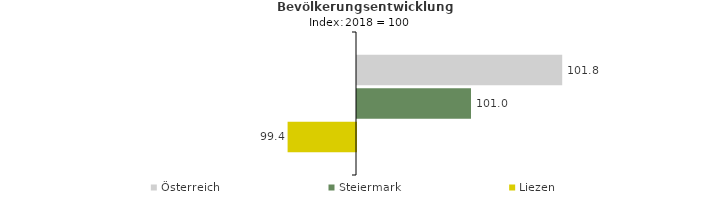
| Category | Österreich | Steiermark | Liezen |
|---|---|---|---|
| 2022.0 | 101.8 | 101 | 99.4 |